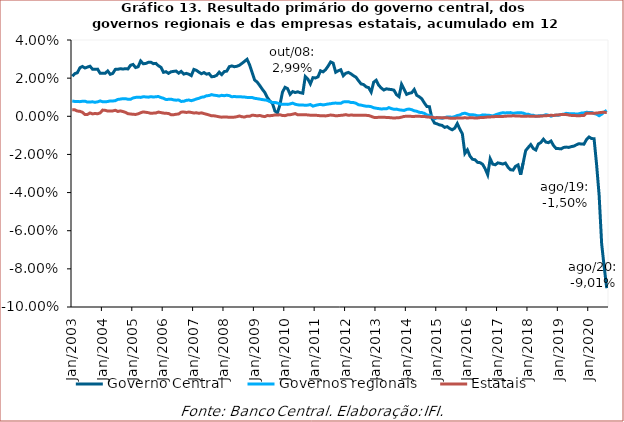
| Category | Governo Central | Governos regionais | Estatais |
|---|---|---|---|
| 2003-01-01 | 0.021 | 0.008 | 0.003 |
| 2003-02-01 | 0.022 | 0.008 | 0.003 |
| 2003-03-01 | 0.023 | 0.008 | 0.003 |
| 2003-04-01 | 0.025 | 0.008 | 0.003 |
| 2003-05-01 | 0.026 | 0.008 | 0.002 |
| 2003-06-01 | 0.025 | 0.008 | 0.001 |
| 2003-07-01 | 0.026 | 0.007 | 0.001 |
| 2003-08-01 | 0.026 | 0.008 | 0.002 |
| 2003-09-01 | 0.025 | 0.008 | 0.001 |
| 2003-10-01 | 0.025 | 0.007 | 0.001 |
| 2003-11-01 | 0.025 | 0.008 | 0.001 |
| 2003-12-01 | 0.023 | 0.008 | 0.002 |
| 2004-01-01 | 0.023 | 0.008 | 0.003 |
| 2004-02-01 | 0.023 | 0.008 | 0.003 |
| 2004-03-01 | 0.024 | 0.008 | 0.003 |
| 2004-04-01 | 0.022 | 0.008 | 0.003 |
| 2004-05-01 | 0.023 | 0.008 | 0.003 |
| 2004-06-01 | 0.025 | 0.008 | 0.003 |
| 2004-07-01 | 0.025 | 0.009 | 0.003 |
| 2004-08-01 | 0.025 | 0.009 | 0.003 |
| 2004-09-01 | 0.025 | 0.009 | 0.002 |
| 2004-10-01 | 0.025 | 0.009 | 0.002 |
| 2004-11-01 | 0.025 | 0.009 | 0.001 |
| 2004-12-01 | 0.027 | 0.009 | 0.001 |
| 2005-01-01 | 0.027 | 0.01 | 0.001 |
| 2005-02-01 | 0.026 | 0.01 | 0.001 |
| 2005-03-01 | 0.026 | 0.01 | 0.001 |
| 2005-04-01 | 0.029 | 0.01 | 0.002 |
| 2005-05-01 | 0.028 | 0.01 | 0.002 |
| 2005-06-01 | 0.028 | 0.01 | 0.002 |
| 2005-07-01 | 0.028 | 0.01 | 0.002 |
| 2005-08-01 | 0.028 | 0.01 | 0.002 |
| 2005-09-01 | 0.028 | 0.01 | 0.002 |
| 2005-10-01 | 0.028 | 0.01 | 0.002 |
| 2005-11-01 | 0.027 | 0.01 | 0.002 |
| 2005-12-01 | 0.026 | 0.01 | 0.002 |
| 2006-01-01 | 0.023 | 0.009 | 0.002 |
| 2006-02-01 | 0.023 | 0.009 | 0.002 |
| 2006-03-01 | 0.023 | 0.009 | 0.002 |
| 2006-04-01 | 0.023 | 0.009 | 0.001 |
| 2006-05-01 | 0.024 | 0.009 | 0.001 |
| 2006-06-01 | 0.024 | 0.008 | 0.001 |
| 2006-07-01 | 0.023 | 0.009 | 0.001 |
| 2006-08-01 | 0.024 | 0.008 | 0.002 |
| 2006-09-01 | 0.022 | 0.008 | 0.002 |
| 2006-10-01 | 0.023 | 0.008 | 0.002 |
| 2006-11-01 | 0.022 | 0.009 | 0.002 |
| 2006-12-01 | 0.021 | 0.008 | 0.002 |
| 2007-01-01 | 0.025 | 0.009 | 0.002 |
| 2007-02-01 | 0.024 | 0.009 | 0.002 |
| 2007-03-01 | 0.023 | 0.009 | 0.002 |
| 2007-04-01 | 0.022 | 0.01 | 0.002 |
| 2007-05-01 | 0.023 | 0.01 | 0.001 |
| 2007-06-01 | 0.022 | 0.011 | 0.001 |
| 2007-07-01 | 0.022 | 0.011 | 0.001 |
| 2007-08-01 | 0.021 | 0.011 | 0 |
| 2007-09-01 | 0.021 | 0.011 | 0 |
| 2007-10-01 | 0.021 | 0.011 | 0 |
| 2007-11-01 | 0.023 | 0.011 | 0 |
| 2007-12-01 | 0.022 | 0.011 | 0 |
| 2008-01-01 | 0.023 | 0.011 | 0 |
| 2008-02-01 | 0.024 | 0.011 | 0 |
| 2008-03-01 | 0.026 | 0.011 | -0.001 |
| 2008-04-01 | 0.026 | 0.01 | -0.001 |
| 2008-05-01 | 0.026 | 0.01 | 0 |
| 2008-06-01 | 0.026 | 0.01 | 0 |
| 2008-07-01 | 0.027 | 0.01 | 0 |
| 2008-08-01 | 0.028 | 0.01 | 0 |
| 2008-09-01 | 0.029 | 0.01 | 0 |
| 2008-10-01 | 0.03 | 0.01 | 0 |
| 2008-11-01 | 0.027 | 0.01 | 0 |
| 2008-12-01 | 0.023 | 0.01 | 0.001 |
| 2009-01-01 | 0.019 | 0.009 | 0 |
| 2009-02-01 | 0.018 | 0.009 | 0 |
| 2009-03-01 | 0.016 | 0.009 | 0 |
| 2009-04-01 | 0.014 | 0.009 | 0 |
| 2009-05-01 | 0.013 | 0.009 | 0 |
| 2009-06-01 | 0.01 | 0.008 | 0 |
| 2009-07-01 | 0.008 | 0.008 | 0 |
| 2009-08-01 | 0.007 | 0.007 | 0 |
| 2009-09-01 | 0.003 | 0.007 | 0.001 |
| 2009-10-01 | 0.002 | 0.007 | 0.001 |
| 2009-11-01 | 0.006 | 0.006 | 0.001 |
| 2009-12-01 | 0.013 | 0.006 | 0 |
| 2010-01-01 | 0.015 | 0.006 | 0 |
| 2010-02-01 | 0.015 | 0.006 | 0.001 |
| 2010-03-01 | 0.012 | 0.006 | 0.001 |
| 2010-04-01 | 0.013 | 0.007 | 0.001 |
| 2010-05-01 | 0.012 | 0.006 | 0.001 |
| 2010-06-01 | 0.013 | 0.006 | 0.001 |
| 2010-07-01 | 0.012 | 0.006 | 0.001 |
| 2010-08-01 | 0.012 | 0.006 | 0.001 |
| 2010-09-01 | 0.021 | 0.006 | 0.001 |
| 2010-10-01 | 0.02 | 0.006 | 0.001 |
| 2010-11-01 | 0.017 | 0.006 | 0.001 |
| 2010-12-01 | 0.02 | 0.005 | 0.001 |
| 2011-01-01 | 0.02 | 0.006 | 0 |
| 2011-02-01 | 0.021 | 0.006 | 0 |
| 2011-03-01 | 0.024 | 0.006 | 0 |
| 2011-04-01 | 0.023 | 0.006 | 0 |
| 2011-05-01 | 0.024 | 0.006 | 0 |
| 2011-06-01 | 0.026 | 0.006 | 0 |
| 2011-07-01 | 0.028 | 0.007 | 0.001 |
| 2011-08-01 | 0.028 | 0.007 | 0.001 |
| 2011-09-01 | 0.023 | 0.007 | 0 |
| 2011-10-01 | 0.024 | 0.007 | 0 |
| 2011-11-01 | 0.024 | 0.007 | 0 |
| 2011-12-01 | 0.021 | 0.008 | 0.001 |
| 2012-01-01 | 0.023 | 0.008 | 0.001 |
| 2012-02-01 | 0.023 | 0.008 | 0.001 |
| 2012-03-01 | 0.022 | 0.007 | 0.001 |
| 2012-04-01 | 0.021 | 0.007 | 0.001 |
| 2012-05-01 | 0.02 | 0.007 | 0 |
| 2012-06-01 | 0.019 | 0.006 | 0.001 |
| 2012-07-01 | 0.017 | 0.006 | 0 |
| 2012-08-01 | 0.017 | 0.006 | 0.001 |
| 2012-09-01 | 0.015 | 0.005 | 0 |
| 2012-10-01 | 0.015 | 0.005 | 0 |
| 2012-11-01 | 0.013 | 0.005 | 0 |
| 2012-12-01 | 0.018 | 0.004 | -0.001 |
| 2013-01-01 | 0.019 | 0.004 | -0.001 |
| 2013-02-01 | 0.016 | 0.004 | -0.001 |
| 2013-03-01 | 0.015 | 0.004 | 0 |
| 2013-04-01 | 0.014 | 0.004 | 0 |
| 2013-05-01 | 0.014 | 0.004 | -0.001 |
| 2013-06-01 | 0.014 | 0.005 | -0.001 |
| 2013-07-01 | 0.014 | 0.004 | -0.001 |
| 2013-08-01 | 0.014 | 0.004 | -0.001 |
| 2013-09-01 | 0.011 | 0.004 | -0.001 |
| 2013-10-01 | 0.01 | 0.003 | -0.001 |
| 2013-11-01 | 0.017 | 0.003 | 0 |
| 2013-12-01 | 0.014 | 0.003 | 0 |
| 2014-01-01 | 0.011 | 0.004 | 0 |
| 2014-02-01 | 0.012 | 0.004 | 0 |
| 2014-03-01 | 0.012 | 0.003 | 0 |
| 2014-04-01 | 0.014 | 0.003 | 0 |
| 2014-05-01 | 0.011 | 0.003 | 0 |
| 2014-06-01 | 0.01 | 0.002 | 0 |
| 2014-07-01 | 0.009 | 0.002 | 0 |
| 2014-08-01 | 0.007 | 0.002 | 0 |
| 2014-09-01 | 0.005 | 0.001 | 0 |
| 2014-10-01 | 0.005 | 0 | 0 |
| 2014-11-01 | -0.001 | 0 | 0 |
| 2014-12-01 | -0.004 | -0.001 | -0.001 |
| 2015-01-01 | -0.004 | -0.001 | -0.001 |
| 2015-02-01 | -0.005 | -0.001 | -0.001 |
| 2015-03-01 | -0.005 | -0.001 | -0.001 |
| 2015-04-01 | -0.006 | -0.001 | -0.001 |
| 2015-05-01 | -0.005 | 0 | -0.001 |
| 2015-06-01 | -0.006 | 0 | -0.001 |
| 2015-07-01 | -0.007 | -0.001 | -0.001 |
| 2015-08-01 | -0.006 | 0 | -0.001 |
| 2015-09-01 | -0.004 | 0 | -0.001 |
| 2015-10-01 | -0.007 | 0.001 | -0.001 |
| 2015-11-01 | -0.009 | 0.001 | -0.001 |
| 2015-12-01 | -0.019 | 0.002 | -0.001 |
| 2016-01-01 | -0.018 | 0.001 | -0.001 |
| 2016-02-01 | -0.021 | 0.001 | -0.001 |
| 2016-03-01 | -0.023 | 0.001 | -0.001 |
| 2016-04-01 | -0.023 | 0.001 | -0.001 |
| 2016-05-01 | -0.024 | 0 | -0.001 |
| 2016-06-01 | -0.024 | 0 | -0.001 |
| 2016-07-01 | -0.025 | 0.001 | -0.001 |
| 2016-08-01 | -0.028 | 0.001 | -0.001 |
| 2016-09-01 | -0.031 | 0.001 | 0 |
| 2016-10-01 | -0.022 | 0 | 0 |
| 2016-11-01 | -0.025 | 0 | 0 |
| 2016-12-01 | -0.025 | 0.001 | 0 |
| 2017-01-01 | -0.024 | 0.001 | 0 |
| 2017-02-01 | -0.025 | 0.002 | 0 |
| 2017-03-01 | -0.025 | 0.002 | 0 |
| 2017-04-01 | -0.025 | 0.002 | 0 |
| 2017-05-01 | -0.027 | 0.002 | 0 |
| 2017-06-01 | -0.028 | 0.002 | 0 |
| 2017-07-01 | -0.028 | 0.002 | 0 |
| 2017-08-01 | -0.026 | 0.002 | 0 |
| 2017-09-01 | -0.025 | 0.002 | 0 |
| 2017-10-01 | -0.031 | 0.002 | 0 |
| 2017-11-01 | -0.024 | 0.002 | 0 |
| 2017-12-01 | -0.018 | 0.001 | 0 |
| 2018-01-01 | -0.016 | 0.001 | 0 |
| 2018-02-01 | -0.015 | 0.001 | 0 |
| 2018-03-01 | -0.017 | 0.001 | 0 |
| 2018-04-01 | -0.018 | 0 | 0 |
| 2018-05-01 | -0.015 | 0 | 0 |
| 2018-06-01 | -0.014 | 0 | 0 |
| 2018-07-01 | -0.012 | 0 | 0 |
| 2018-08-01 | -0.014 | 0.001 | 0 |
| 2018-09-01 | -0.014 | 0.001 | 0 |
| 2018-10-01 | -0.013 | 0 | 0.001 |
| 2018-11-01 | -0.015 | 0 | 0 |
| 2018-12-01 | -0.017 | 0.001 | 0.001 |
| 2019-01-01 | -0.017 | 0.001 | 0.001 |
| 2019-02-01 | -0.017 | 0.001 | 0.001 |
| 2019-03-01 | -0.016 | 0.001 | 0.001 |
| 2019-04-01 | -0.016 | 0.002 | 0.001 |
| 2019-05-01 | -0.016 | 0.001 | 0.001 |
| 2019-06-01 | -0.016 | 0.001 | 0 |
| 2019-07-01 | -0.016 | 0.001 | 0 |
| 2019-08-01 | -0.015 | 0.001 | 0 |
| 2019-09-01 | -0.014 | 0.001 | 0 |
| 2019-10-01 | -0.015 | 0.002 | 0 |
| 2019-11-01 | -0.015 | 0.002 | 0 |
| 2019-12-01 | -0.012 | 0.002 | 0.002 |
| 2020-01-01 | -0.011 | 0.002 | 0.002 |
| 2020-02-01 | -0.012 | 0.002 | 0.002 |
| 2020-03-01 | -0.012 | 0.001 | 0.002 |
| 2020-04-01 | -0.025 | 0.001 | 0.002 |
| 2020-05-01 | -0.041 | 0 | 0.002 |
| 2020-06-01 | -0.067 | 0.001 | 0.002 |
| 2020-07-01 | -0.079 | 0.002 | 0.002 |
| 2020-08-01 | -0.09 | 0.003 | 0.002 |